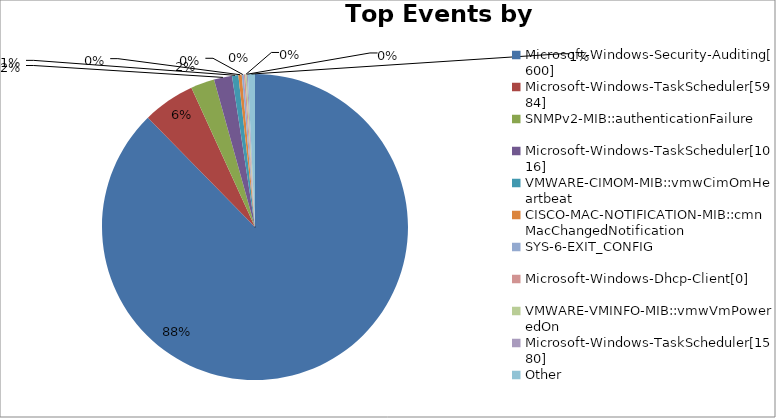
| Category | Series 0 |
|---|---|
| Microsoft-Windows-Security-Auditing[600] | 137182 |
| Microsoft-Windows-TaskScheduler[5984] | 8632 |
| SNMPv2-MIB::authenticationFailure | 3923 |
| Microsoft-Windows-TaskScheduler[1016] | 2989 |
| VMWARE-CIMOM-MIB::vmwCimOmHeartbeat | 1050 |
| CISCO-MAC-NOTIFICATION-MIB::cmnMacChangedNotification | 554 |
| SYS-6-EXIT_CONFIG | 347 |
| Microsoft-Windows-Dhcp-Client[0] | 245 |
| VMWARE-VMINFO-MIB::vmwVmPoweredOn | 219 |
| Microsoft-Windows-TaskScheduler[1580] | 195 |
| Other | 1158 |